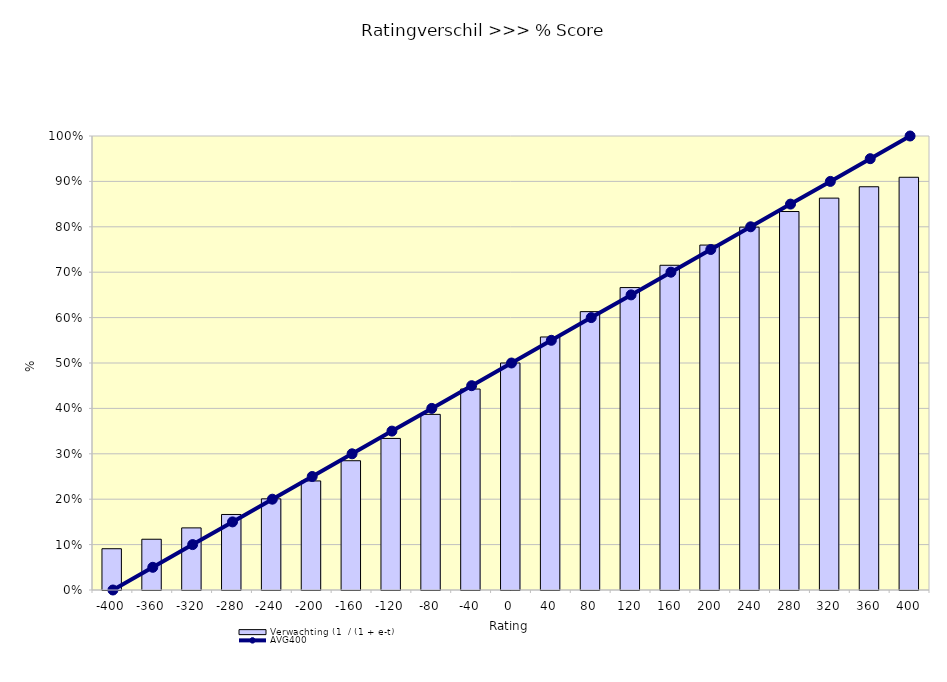
| Category | Verwachting (1  / (1 + e-t) |
|---|---|
| -400.0 | 0.091 |
| -360.0 | 0.112 |
| -320.0 | 0.137 |
| -280.0 | 0.166 |
| -240.0 | 0.201 |
| -200.0 | 0.24 |
| -160.0 | 0.285 |
| -120.0 | 0.334 |
| -80.0 | 0.387 |
| -40.0 | 0.443 |
| 0.0 | 0.5 |
| 40.0 | 0.557 |
| 80.0 | 0.613 |
| 120.0 | 0.666 |
| 160.0 | 0.715 |
| 200.0 | 0.76 |
| 240.0 | 0.799 |
| 280.0 | 0.834 |
| 320.0 | 0.863 |
| 360.0 | 0.888 |
| 400.0 | 0.909 |